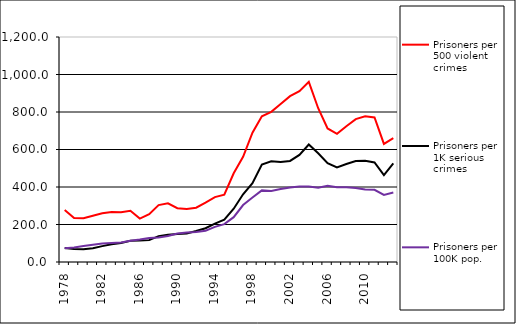
| Category | Prisoners per 500 violent crimes | Prisoners per 1K serious crimes | Prisoners per 100K pop. |
|---|---|---|---|
| 1978.0 | 277.49 | 74.962 | 73.349 |
| 1979.0 | 234.532 | 69.845 | 77.903 |
| 1980.0 | 232.857 | 67.378 | 85.026 |
| 1981.0 | 246.238 | 73.43 | 92.53 |
| 1982.0 | 259.667 | 84.722 | 98.93 |
| 1983.0 | 267.089 | 94.907 | 101.979 |
| 1984.0 | 265.507 | 101.258 | 104.364 |
| 1985.0 | 273.026 | 112.708 | 112.984 |
| 1986.0 | 231.664 | 114.792 | 119.478 |
| 1987.0 | 254.953 | 116.65 | 127.439 |
| 1988.0 | 303.678 | 137.989 | 130.198 |
| 1989.0 | 312.673 | 145.646 | 139.203 |
| 1990.0 | 287.226 | 149.649 | 152.051 |
| 1991.0 | 283.284 | 152.559 | 156.912 |
| 1992.0 | 289.439 | 164.95 | 159.617 |
| 1993.0 | 316.117 | 180.262 | 167.17 |
| 1994.0 | 346.269 | 204.436 | 187.348 |
| 1995.0 | 358.949 | 225.625 | 201.776 |
| 1996.0 | 473.196 | 284.365 | 239.147 |
| 1997.0 | 561.124 | 360.948 | 303.636 |
| 1998.0 | 689.945 | 419.916 | 343.626 |
| 1999.0 | 776.728 | 520.277 | 381.91 |
| 2000.0 | 800.63 | 536.811 | 379.143 |
| 2001.0 | 842.263 | 533.656 | 389.072 |
| 2002.0 | 884.295 | 538.891 | 397.89 |
| 2003.0 | 911.476 | 570.893 | 403.066 |
| 2004.0 | 960.729 | 626.772 | 403.177 |
| 2005.0 | 820.192 | 579.849 | 396.679 |
| 2006.0 | 712.154 | 527.521 | 407.054 |
| 2007.0 | 683.342 | 504.649 | 398.223 |
| 2008.0 | 724.014 | 522.489 | 398.802 |
| 2009.0 | 762.184 | 538.601 | 394.923 |
| 2010.0 | 776.87 | 539.771 | 386.373 |
| 2011.0 | 770.886 | 530.904 | 385.265 |
| 2012.0 | 629.814 | 463.37 | 357.652 |
| 2013.0 | 660.287 | 525.867 | 370.628 |